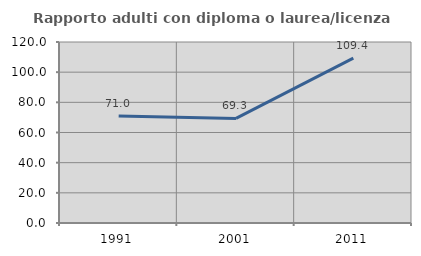
| Category | Rapporto adulti con diploma o laurea/licenza media  |
|---|---|
| 1991.0 | 70.954 |
| 2001.0 | 69.336 |
| 2011.0 | 109.354 |